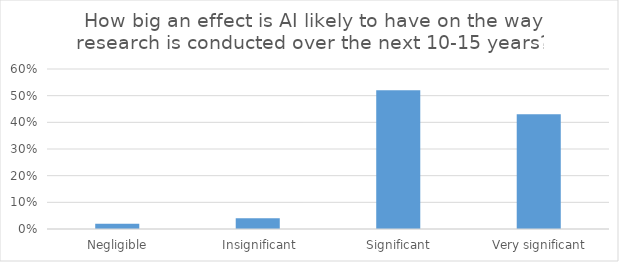
| Category | Series 0 |
|---|---|
|  Negligible | 0.02 |
|  Insignificant | 0.04 |
|  Significant | 0.52 |
|  Very significant | 0.43 |